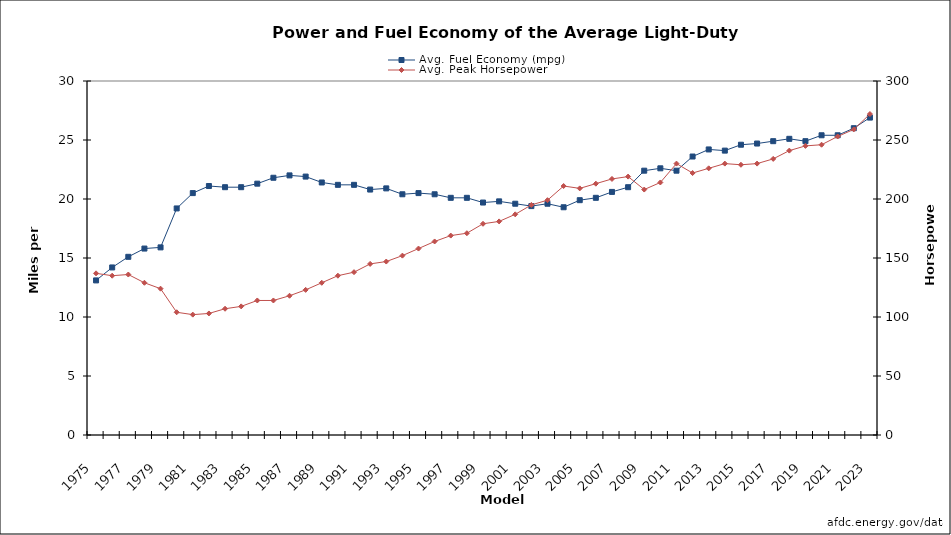
| Category | Avg. Fuel Economy (mpg) |
|---|---|
| 1975.0 | 13.1 |
| 1976.0 | 14.2 |
| 1977.0 | 15.1 |
| 1978.0 | 15.8 |
| 1979.0 | 15.9 |
| 1980.0 | 19.2 |
| 1981.0 | 20.5 |
| 1982.0 | 21.1 |
| 1983.0 | 21 |
| 1984.0 | 21 |
| 1985.0 | 21.3 |
| 1986.0 | 21.8 |
| 1987.0 | 22 |
| 1988.0 | 21.9 |
| 1989.0 | 21.4 |
| 1990.0 | 21.2 |
| 1991.0 | 21.2 |
| 1992.0 | 20.8 |
| 1993.0 | 20.9 |
| 1994.0 | 20.4 |
| 1995.0 | 20.5 |
| 1996.0 | 20.4 |
| 1997.0 | 20.1 |
| 1998.0 | 20.1 |
| 1999.0 | 19.7 |
| 2000.0 | 19.8 |
| 2001.0 | 19.6 |
| 2002.0 | 19.4 |
| 2003.0 | 19.6 |
| 2004.0 | 19.3 |
| 2005.0 | 19.9 |
| 2006.0 | 20.1 |
| 2007.0 | 20.6 |
| 2008.0 | 21 |
| 2009.0 | 22.4 |
| 2010.0 | 22.6 |
| 2011.0 | 22.4 |
| 2012.0 | 23.6 |
| 2013.0 | 24.2 |
| 2014.0 | 24.1 |
| 2015.0 | 24.6 |
| 2016.0 | 24.7 |
| 2017.0 | 24.9 |
| 2018.0 | 25.1 |
| 2019.0 | 24.9 |
| 2020.0 | 25.4 |
| 2021.0 | 25.4 |
| 2022.0 | 26 |
| 2023.0 | 26.9 |